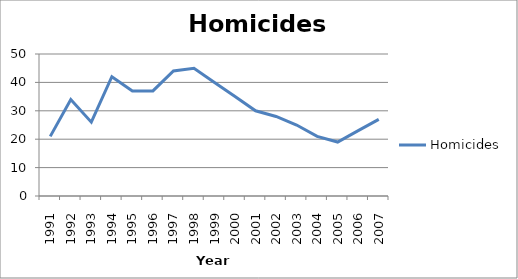
| Category | Homicides |
|---|---|
| 1991.0 | 21 |
| 1992.0 | 34 |
| 1993.0 | 26 |
| 1994.0 | 42 |
| 1995.0 | 37 |
| 1996.0 | 37 |
| 1997.0 | 44 |
| 1998.0 | 45 |
| 1999.0 | 40 |
| 2000.0 | 35 |
| 2001.0 | 30 |
| 2002.0 | 28 |
| 2003.0 | 25 |
| 2004.0 | 21 |
| 2005.0 | 19 |
| 2006.0 | 23 |
| 2007.0 | 27 |